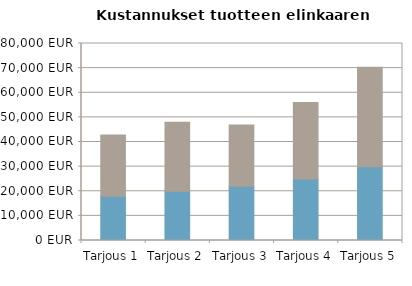
| Category | Anskaffningskostnad exkl. restvärde | HANKINTAKUSTANNUS KAPPALETTA KOHDEN | MUUT KULUT YHTEENSÄ KAPPALETTA KOHDEN, NYKYARVO | KÄYTTÖKUSTANNUKSET KAPPALETTA KOHDEN, NYKYARVO |
|---|---|---|---|---|
| Tarjous 1 | 18000 | 0 | 0 | 24863.986 |
| Tarjous 2 | 20000 | 0 | 0 | 27971.985 |
| Tarjous 3 | 22000 | 0 | 0 | 24863.986 |
| Tarjous 4 | 25000 | 0 | 0 | 31079.983 |
| Tarjous 5 | 30000 | 0 | 0 | 40403.978 |